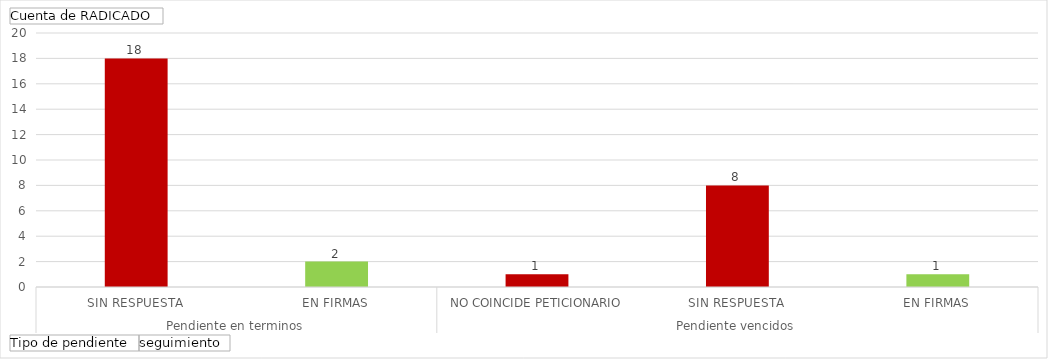
| Category | Total |
|---|---|
| 0 | 18 |
| 1 | 2 |
| 2 | 1 |
| 3 | 8 |
| 4 | 1 |